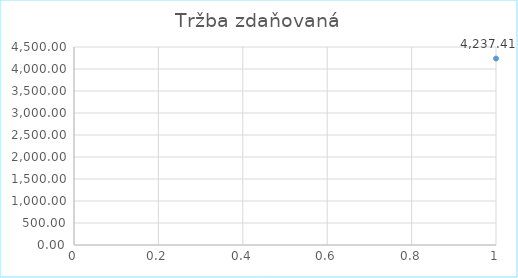
| Category | Series 0 |
|---|---|
| 0 | 4237.41 |
| 1 | 0 |
| 2 | 0 |
| 3 | 0 |
| 4 | 0 |
| 5 | 0 |
| 6 | 0 |
| 7 | 0 |
| 8 | 0 |
| 9 | 0 |
| 10 | 0 |
| 11 | 0 |